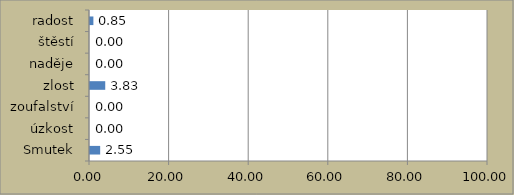
| Category | Series 0 |
|---|---|
| Smutek | 2.553 |
| úzkost | 0 |
| zoufalství | 0 |
| zlost | 3.83 |
| naděje | 0 |
| štěstí | 0 |
| radost | 0.851 |